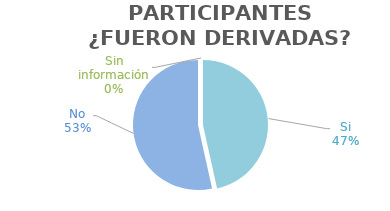
| Category | Series 0 |
|---|---|
| Si | 0.465 |
| No | 0.535 |
| Sin información | 0 |